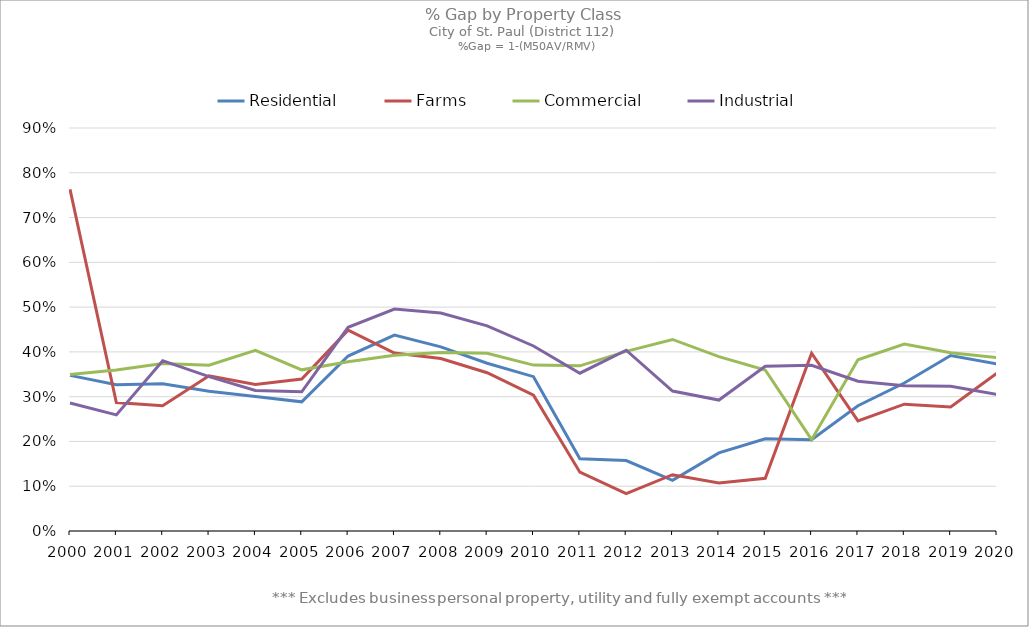
| Category | Residential | Farms | Commercial | Industrial |
|---|---|---|---|---|
| 2000.0 | 0.348 | 0.763 | 0.35 | 0.286 |
| 2001.0 | 0.327 | 0.287 | 0.359 | 0.259 |
| 2002.0 | 0.329 | 0.28 | 0.374 | 0.38 |
| 2003.0 | 0.312 | 0.347 | 0.37 | 0.345 |
| 2004.0 | 0.3 | 0.327 | 0.403 | 0.314 |
| 2005.0 | 0.288 | 0.34 | 0.36 | 0.311 |
| 2006.0 | 0.391 | 0.448 | 0.378 | 0.455 |
| 2007.0 | 0.437 | 0.397 | 0.393 | 0.496 |
| 2008.0 | 0.411 | 0.385 | 0.399 | 0.487 |
| 2009.0 | 0.375 | 0.353 | 0.397 | 0.458 |
| 2010.0 | 0.345 | 0.303 | 0.371 | 0.413 |
| 2011.0 | 0.161 | 0.131 | 0.369 | 0.352 |
| 2012.0 | 0.157 | 0.084 | 0.401 | 0.404 |
| 2013.0 | 0.113 | 0.126 | 0.428 | 0.313 |
| 2014.0 | 0.175 | 0.107 | 0.39 | 0.292 |
| 2015.0 | 0.206 | 0.118 | 0.36 | 0.368 |
| 2016.0 | 0.204 | 0.397 | 0.204 | 0.37 |
| 2017.0 | 0.28 | 0.246 | 0.382 | 0.335 |
| 2018.0 | 0.331 | 0.283 | 0.417 | 0.324 |
| 2019.0 | 0.392 | 0.277 | 0.398 | 0.323 |
| 2020.0 | 0.373 | 0.353 | 0.387 | 0.305 |